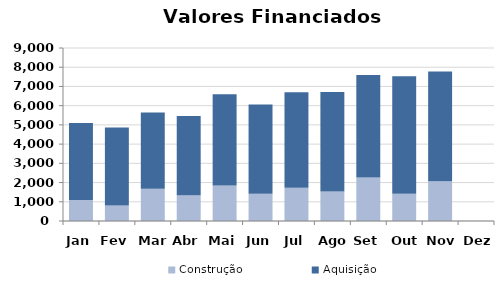
| Category | Construção | Aquisição  |
|---|---|---|
| Jan | 1091.225 | 4005.43 |
| Fev | 806.874 | 4059.044 |
| Mar | 1684.101 | 3954.739 |
| Abr | 1343.897 | 4119.704 |
| Mai | 1850.725 | 4740.725 |
| Jun | 1419.474 | 4644.895 |
| Jul | 1735.812 | 4964.527 |
| Ago | 1534.929 | 5174.54 |
| Set | 2264.813 | 5328.862 |
| Out | 1414.69 | 6118.877 |
| Nov | 2064.398 | 5717.272 |
| Dez | 0 | 0 |